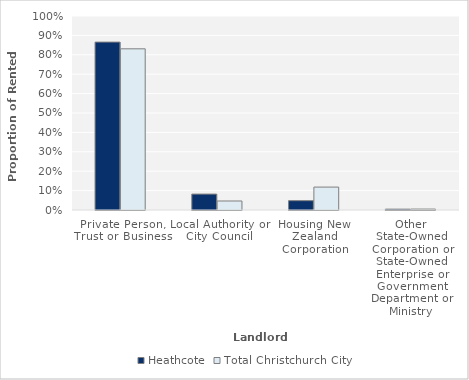
| Category | Heathcote | Total Christchurch City |
|---|---|---|
| Private Person, Trust or Business | 0.865 | 0.831 |
| Local Authority or City Council | 0.082 | 0.046 |
| Housing New Zealand Corporation | 0.048 | 0.118 |
| Other State-Owned Corporation or State-Owned Enterprise or Government Department or Ministry | 0.004 | 0.005 |